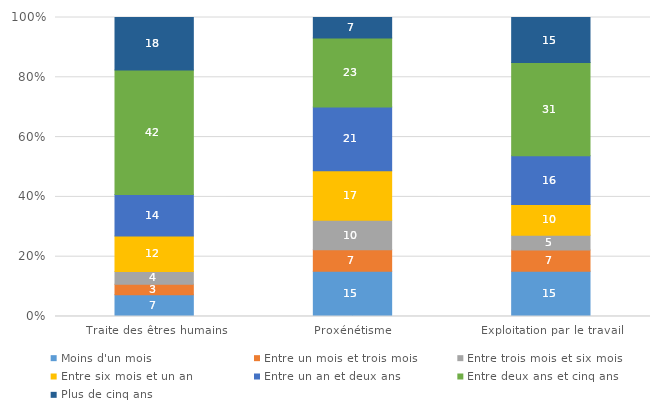
| Category | Moins d'un mois | Entre un mois et trois mois | Entre trois mois et six mois | Entre six mois et un an | Entre un an et deux ans | Entre deux ans et cinq ans | Plus de cinq ans |
|---|---|---|---|---|---|---|---|
| Traite des êtres humains | 7.27 | 3.49 | 4.28 | 11.84 | 13.92 | 41.6 | 17.59 |
| Proxénétisme | 15.11 | 7.21 | 9.85 | 16.54 | 21.39 | 23.05 | 6.85 |
| Exploitation par le travail | 15.16 | 7.11 | 4.92 | 10.24 | 16.37 | 31.13 | 15.07 |